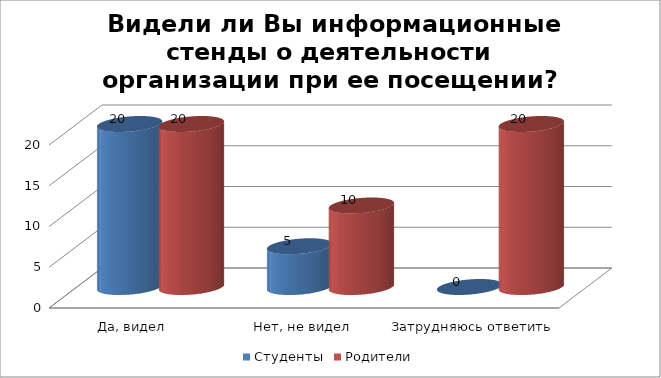
| Category | Студенты | Родители |
|---|---|---|
| Да, видел | 20 | 20 |
| Нет, не видел | 5 | 10 |
| Затрудняюсь ответить | 0 | 20 |